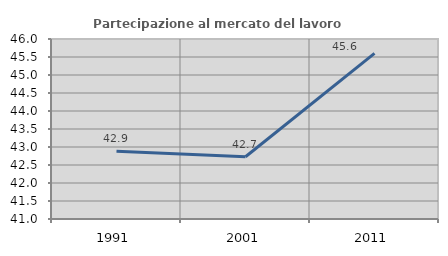
| Category | Partecipazione al mercato del lavoro  femminile |
|---|---|
| 1991.0 | 42.884 |
| 2001.0 | 42.729 |
| 2011.0 | 45.603 |